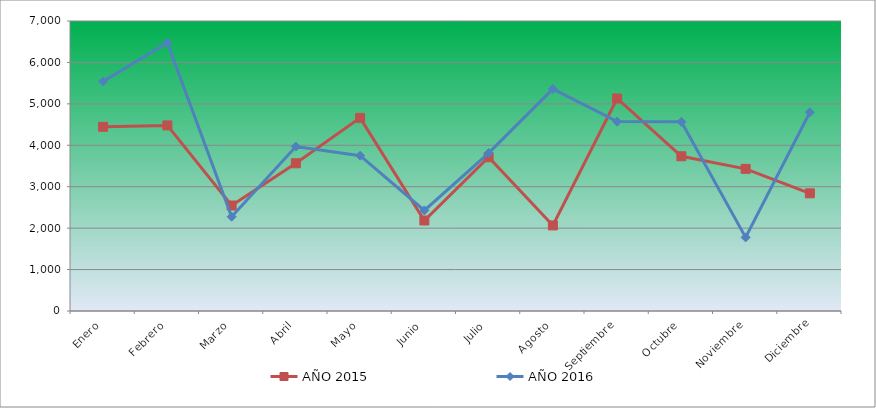
| Category | AÑO 2015 | AÑO 2016 |
|---|---|---|
| Enero | 4446.084 | 5542.048 |
| Febrero | 4479.56 | 6476.441 |
| Marzo | 2546.357 | 2276.417 |
| Abril | 3565.84 | 3969.358 |
| Mayo | 4661.909 | 3749.751 |
| Junio | 2184.346 | 2428.455 |
| Julio | 3711.324 | 3811.943 |
| Agosto | 2065.979 | 5360.722 |
| Septiembre | 5129.519 | 4571.789 |
| Octubre | 3735.08 | 4565.443 |
| Noviembre | 3431.437 | 1777.033 |
| Diciembre | 2840.47 | 4796.996 |